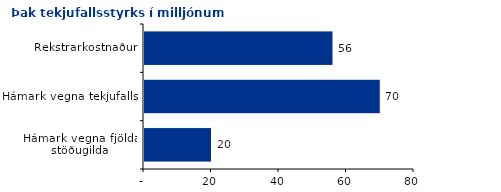
| Category | Series 0 |
|---|---|
| Hámark vegna fjölda stöðugilda | 20000000 |
| Hámark vegna tekjufalls | 70000000 |
| Rekstrarkostnaður | 56000000 |